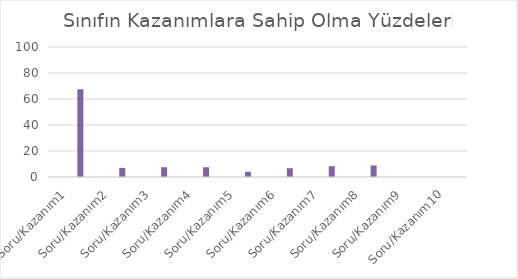
| Category | Series 0 | Series 1 | Series 2 | Series 3 |
|---|---|---|---|---|
| Soru/Kazanım1 |  |  |  | 67.5 |
| Soru/Kazanım2 |  |  |  | 7 |
| Soru/Kazanım3 |  |  |  | 7.5 |
| Soru/Kazanım4 |  |  |  | 7.5 |
| Soru/Kazanım5 |  |  |  | 4 |
| Soru/Kazanım6 |  |  |  | 6.75 |
| Soru/Kazanım7 |  |  |  | 8.333 |
| Soru/Kazanım8 |  |  |  | 8.875 |
| Soru/Kazanım9 |  |  |  | 0 |
| Soru/Kazanım10 |  |  |  | 0 |